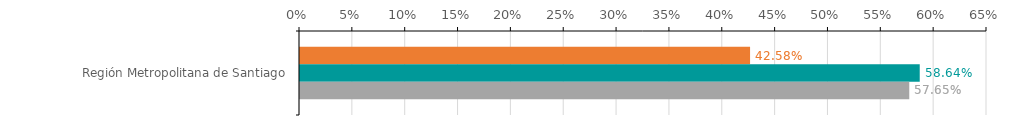
| Category | Numero de operaciones | Monto ($ MM) | Garantia ($ MM) |
|---|---|---|---|
| Región Metropolitana de Santiago | 0.426 | 0.586 | 0.576 |